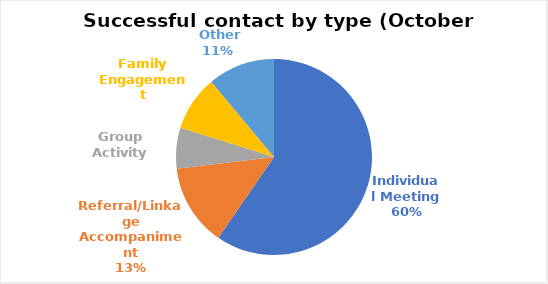
| Category | Series 0 |
|---|---|
| Individual Meeting | 124 |
| Referral/Linkage Accompaniment | 28 |
| Group Activity | 14 |
| Family Engagement | 19 |
|  Other | 23 |